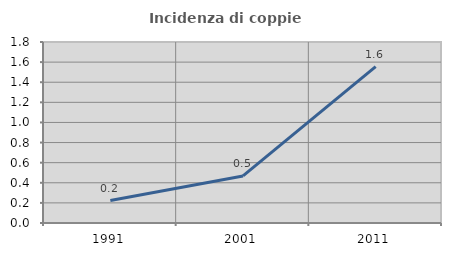
| Category | Incidenza di coppie miste |
|---|---|
| 1991.0 | 0.223 |
| 2001.0 | 0.468 |
| 2011.0 | 1.554 |